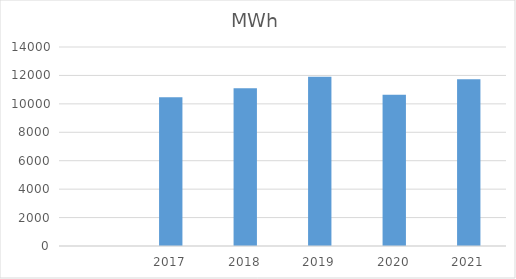
| Category | MWh |
|---|---|
| nan | 0 |
| 2017.0 | 10471.336 |
| 2018.0 | 11104.098 |
| 2019.0 | 11900.462 |
| 2020.0 | 10638.043 |
| 2021.0 | 11730.771 |